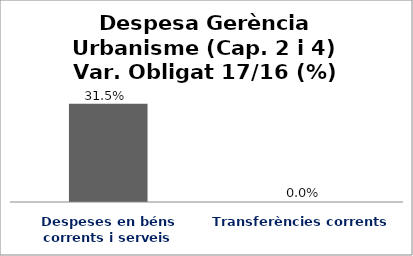
| Category | Series 0 |
|---|---|
| Despeses en béns corrents i serveis | 0.315 |
| Transferències corrents | 0 |